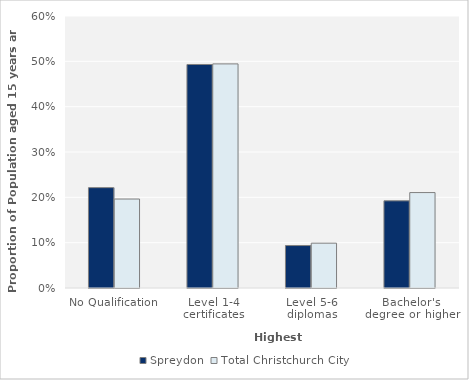
| Category | Spreydon | Total Christchurch City |
|---|---|---|
| No Qualification | 0.221 | 0.196 |
| Level 1-4 certificates | 0.493 | 0.494 |
| Level 5-6 diplomas | 0.094 | 0.099 |
| Bachelor's degree or higher | 0.192 | 0.211 |